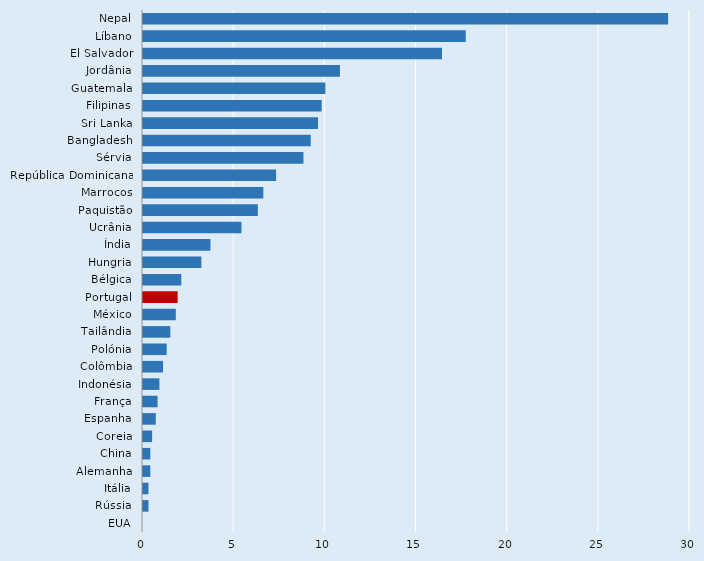
| Category | Series 0 |
|---|---|
| Nepal | 28.8 |
| Líbano | 17.7 |
| El Salvador | 16.4 |
| Jordânia | 10.8 |
| Guatemala | 10 |
| Filipinas | 9.8 |
| Sri Lanka | 9.6 |
| Bangladesh | 9.2 |
| Sérvia | 8.8 |
| República Dominicana | 7.3 |
| Marrocos | 6.6 |
| Paquistão | 6.3 |
| Ucrânia | 5.4 |
| Índia | 3.7 |
| Hungria | 3.2 |
| Bélgica | 2.1 |
| Portugal | 1.9 |
| México | 1.8 |
| Tailândia | 1.5 |
| Polónia | 1.3 |
| Colômbia | 1.1 |
| Indonésia | 0.9 |
| França | 0.8 |
| Espanha | 0.7 |
| Coreia | 0.5 |
| China | 0.4 |
| Alemanha | 0.4 |
| Itália | 0.3 |
| Rússia | 0.3 |
| EUA | 0 |